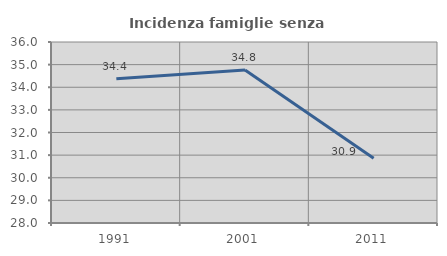
| Category | Incidenza famiglie senza nuclei |
|---|---|
| 1991.0 | 34.375 |
| 2001.0 | 34.766 |
| 2011.0 | 30.864 |